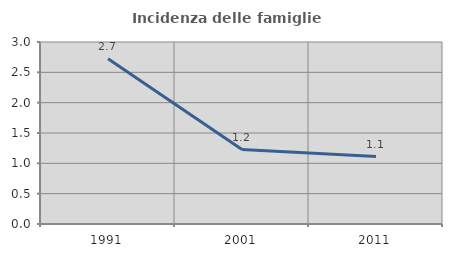
| Category | Incidenza delle famiglie numerose |
|---|---|
| 1991.0 | 2.724 |
| 2001.0 | 1.227 |
| 2011.0 | 1.111 |